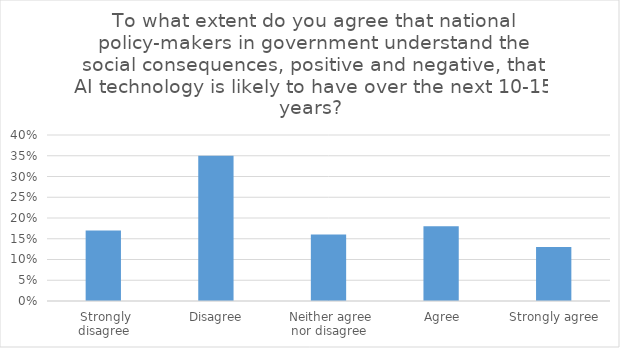
| Category | Series 0 |
|---|---|
|  Strongly disagree | 0.17 |
|  Disagree | 0.35 |
|  Neither agree nor disagree | 0.16 |
|  Agree | 0.18 |
|  Strongly agree | 0.13 |